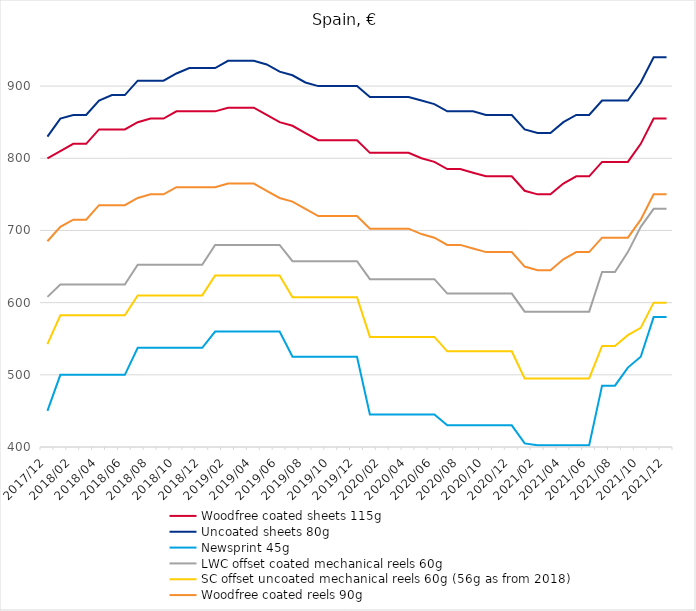
| Category | Woodfree coated sheets 115g | Uncoated sheets 80g | Newsprint 45g | LWC offset coated mechanical reels 60g | SC offset uncoated mechanical reels 60g (56g as from 2018) | Woodfree coated reels 90g |
|---|---|---|---|---|---|---|
| 2017/12 | 800 | 830 | 450 | 608 | 542.5 | 685 |
| 2018/01 | 810 | 855 | 500 | 625 | 582.5 | 705 |
| 2018/02 | 820 | 860 | 500 | 625 | 582.5 | 715 |
| 2018/03 | 820 | 860 | 500 | 625 | 582.5 | 715 |
| 2018/04 | 840 | 880 | 500 | 625 | 582.5 | 735 |
| 2018/05 | 840 | 887.5 | 500 | 625 | 582.5 | 735 |
| 2018/06 | 840 | 887.5 | 500 | 625 | 582.5 | 735 |
| 2018/07 | 850 | 907.5 | 537.5 | 652.5 | 610 | 745 |
| 2018/08 | 855 | 907.5 | 537.5 | 652.5 | 610 | 750 |
| 2018/09 | 855 | 907.5 | 537.5 | 652.5 | 610 | 750 |
| 2018/10 | 865 | 917.5 | 537.5 | 652.5 | 610 | 760 |
| 2018/11 | 865 | 925 | 537.5 | 652.5 | 610 | 760 |
| 2018/12 | 865 | 925 | 537.5 | 652.5 | 610 | 760 |
| 2019/01 | 865 | 925 | 560 | 680 | 637.5 | 760 |
| 2019/02 | 870 | 935 | 560 | 680 | 637.5 | 765 |
| 2019/03 | 870 | 935 | 560 | 680 | 637.5 | 765 |
| 2019/04 | 870 | 935 | 560 | 680 | 637.5 | 765 |
| 2019/05 | 860 | 930 | 560 | 680 | 637.5 | 755 |
| 2019/06 | 850 | 920 | 560 | 680 | 637.5 | 745 |
| 2019/07 | 845 | 915 | 525 | 657.5 | 607.5 | 740 |
| 2019/08 | 835 | 905 | 525 | 657.5 | 607.5 | 730 |
| 2019/09 | 825 | 900 | 525 | 657.5 | 607.5 | 720 |
| 2019/10 | 825 | 900 | 525 | 657.5 | 607.5 | 720 |
| 2019/11 | 825 | 900 | 525 | 657.5 | 607.5 | 720 |
| 2019/12 | 825 | 900 | 525 | 657.5 | 607.5 | 720 |
| 2020/01 | 807.5 | 885 | 445 | 632.5 | 552.5 | 702.5 |
| 2020/02 | 807.5 | 885 | 445 | 632.5 | 552.5 | 702.5 |
| 2020/03 | 807.5 | 885 | 445 | 632.5 | 552.5 | 702.5 |
| 2020/04 | 807.5 | 885 | 445 | 632.5 | 552.5 | 702.5 |
| 2020/05 | 800 | 880 | 445 | 632.5 | 552.5 | 695 |
| 2020/06 | 795 | 875 | 445 | 632.5 | 552.5 | 690 |
| 2020/07 | 785 | 865 | 430 | 612.5 | 532.5 | 680 |
| 2020/08 | 785 | 865 | 430 | 612.5 | 532.5 | 680 |
| 2020/09 | 780 | 865 | 430 | 612.5 | 532.5 | 675 |
| 2020/10 | 775 | 860 | 430 | 612.5 | 532.5 | 670 |
| 2020/11 | 775 | 860 | 430 | 612.5 | 532.5 | 670 |
| 2020/12 | 775 | 860 | 430 | 612.5 | 532.5 | 670 |
| 2021/01 | 755 | 840 | 405 | 587.5 | 495 | 650 |
| 2021/02 | 750 | 835 | 402.5 | 587.5 | 495 | 645 |
| 2021/03 | 750 | 835 | 402.5 | 587.5 | 495 | 645 |
| 2021/04 | 765 | 850 | 402.5 | 587.5 | 495 | 660 |
| 2021/05 | 775 | 860 | 402.5 | 587.5 | 495 | 670 |
| 2021/06 | 775 | 860 | 402.5 | 587.5 | 495 | 670 |
| 2021/07 | 795 | 880 | 485 | 642.5 | 540 | 690 |
| 2021/08 | 795 | 880 | 485 | 642.5 | 540 | 690 |
| 2021/09 | 795 | 880 | 510 | 670 | 555 | 690 |
| 2021/10 | 820 | 905 | 525 | 705 | 565 | 715 |
| 2021/11 | 855 | 940 | 580 | 730 | 600 | 750 |
| 2021/12 | 855 | 940 | 580 | 730 | 600 | 750 |